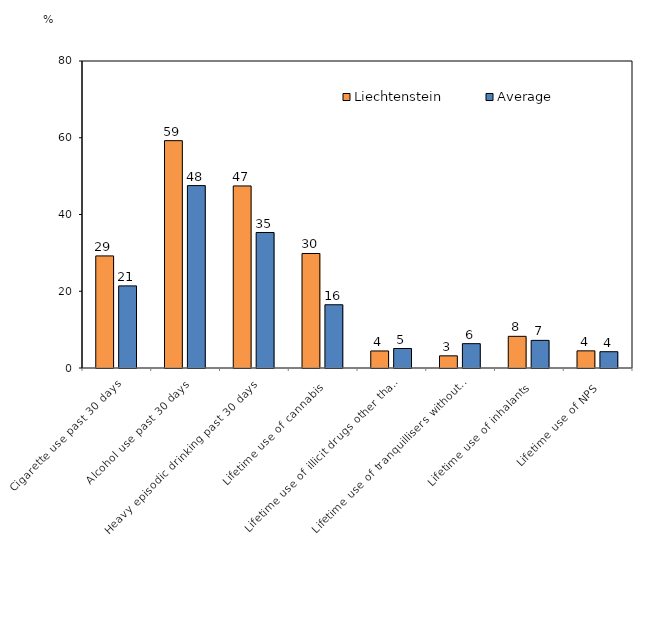
| Category | Liechtenstein | Average |
|---|---|---|
| Cigarette use past 30 days | 29.21 | 21.397 |
| Alcohol use past 30 days | 59.24 | 47.531 |
| Heavy episodic drinking past 30 days | 47.44 | 35.309 |
| Lifetime use of cannabis | 29.84 | 16.48 |
| Lifetime use of illicit drugs other than cannabis | 4.44 | 5.079 |
| Lifetime use of tranquillisers without prescription  | 3.17 | 6.34 |
| Lifetime use of inhalants | 8.25 | 7.202 |
| Lifetime use of NPS | 4.47 | 4.246 |